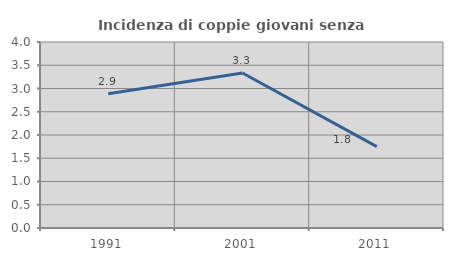
| Category | Incidenza di coppie giovani senza figli |
|---|---|
| 1991.0 | 2.885 |
| 2001.0 | 3.335 |
| 2011.0 | 1.751 |